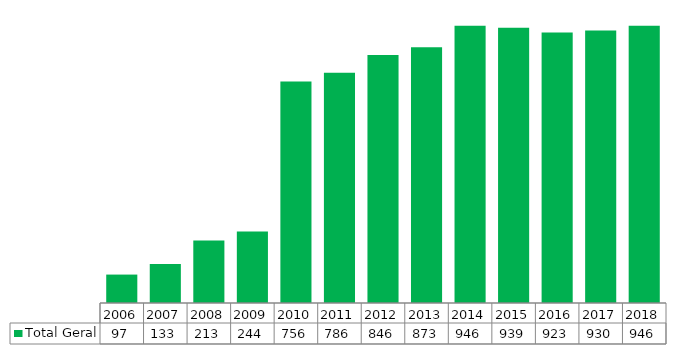
| Category | Total Geral |
|---|---|
| 2006.0 | 97 |
| 2007.0 | 133 |
| 2008.0 | 213 |
| 2009.0 | 244 |
| 2010.0 | 756 |
| 2011.0 | 786 |
| 2012.0 | 846 |
| 2013.0 | 873 |
| 2014.0 | 946 |
| 2015.0 | 939 |
| 2016.0 | 923 |
| 2017.0 | 930 |
| 2018.0 | 946 |